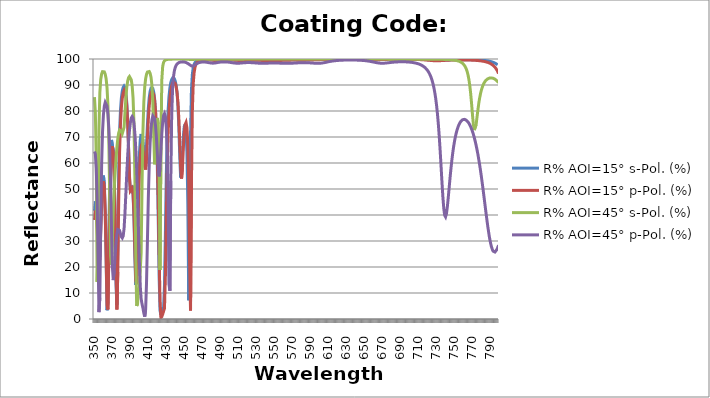
| Category | R% AOI=15° s-Pol. (%) | R% AOI=15° p-Pol. (%) | R% AOI=45° s-Pol. (%) | R% AOI=45° p-Pol. (%) |
|---|---|---|---|---|
| 350.0 | 41.572 | 38.09 | 85.307 | 64.422 |
| 351.0 | 45.249 | 41.699 | 79.458 | 63.448 |
| 352.0 | 44.06 | 40.609 | 61.927 | 58.057 |
| 353.0 | 38.142 | 35.076 | 14.269 | 46.134 |
| 354.0 | 28.981 | 26.792 | 27.487 | 25.16 |
| 355.0 | 21.946 | 20.789 | 72.655 | 2.652 |
| 356.0 | 24.435 | 23.341 | 87.043 | 8.233 |
| 357.0 | 35.24 | 33.382 | 92.11 | 37.025 |
| 358.0 | 46.308 | 43.958 | 94.226 | 59.468 |
| 359.0 | 53.208 | 50.83 | 95.124 | 71.96 |
| 360.0 | 55.157 | 53.018 | 95.356 | 78.546 |
| 361.0 | 51.788 | 50.134 | 95.069 | 81.9 |
| 362.0 | 41.693 | 41.028 | 94.191 | 83.296 |
| 363.0 | 23.242 | 24.379 | 92.413 | 83.25 |
| 364.0 | 3.369 | 5.186 | 88.995 | 81.842 |
| 365.0 | 6.671 | 3.688 | 82.308 | 78.798 |
| 366.0 | 31.47 | 24.735 | 69.187 | 73.466 |
| 367.0 | 52.332 | 46.165 | 46.756 | 64.772 |
| 368.0 | 63.872 | 59.175 | 24.282 | 51.6 |
| 369.0 | 68.868 | 65.331 | 20.784 | 34.683 |
| 370.0 | 69.14 | 66.496 | 30.938 | 19.846 |
| 371.0 | 64.509 | 62.86 | 42.529 | 14.97 |
| 372.0 | 54.734 | 54.538 | 50.104 | 18.5 |
| 373.0 | 37.317 | 39.762 | 56.232 | 24.099 |
| 374.0 | 13.31 | 18.158 | 61.559 | 29.14 |
| 375.0 | 5.451 | 3.654 | 65.991 | 32.612 |
| 376.0 | 29.756 | 18.104 | 69.36 | 34.396 |
| 377.0 | 56.143 | 44.959 | 71.583 | 34.738 |
| 378.0 | 71.897 | 64.163 | 72.684 | 34.034 |
| 379.0 | 80.399 | 75.193 | 72.777 | 32.793 |
| 380.0 | 85.068 | 81.385 | 72.132 | 31.616 |
| 381.0 | 87.674 | 84.901 | 71.341 | 31.146 |
| 382.0 | 89.066 | 86.851 | 71.436 | 31.944 |
| 383.0 | 89.618 | 87.783 | 73.777 | 34.791 |
| 384.0 | 89.06 | 87.495 | 79.353 | 40.877 |
| 385.0 | 87.113 | 85.737 | 85.05 | 48.356 |
| 386.0 | 83.177 | 82.047 | 89.086 | 55.915 |
| 387.0 | 76.172 | 75.563 | 91.504 | 62.707 |
| 388.0 | 65.465 | 65.78 | 92.782 | 68.307 |
| 389.0 | 54.248 | 55.099 | 93.251 | 72.577 |
| 390.0 | 49.335 | 49.266 | 93.024 | 75.545 |
| 391.0 | 50.412 | 49.316 | 91.989 | 77.294 |
| 392.0 | 51.313 | 50.27 | 89.703 | 77.877 |
| 393.0 | 48.096 | 48.085 | 85.043 | 77.252 |
| 394.0 | 38.789 | 40.682 | 75.327 | 75.228 |
| 395.0 | 23.698 | 27.525 | 55.161 | 71.407 |
| 396.0 | 13.07 | 14.785 | 25.367 | 65.736 |
| 397.0 | 19.108 | 13.496 | 5.05 | 57.866 |
| 398.0 | 36.681 | 26.322 | 5.812 | 47.262 |
| 399.0 | 52.706 | 42.764 | 11.521 | 34.568 |
| 400.0 | 63.074 | 55.184 | 12.143 | 22.05 |
| 401.0 | 68.774 | 62.716 | 12.055 | 12.736 |
| 402.0 | 71.173 | 66.453 | 25.494 | 7.816 |
| 403.0 | 71.048 | 67.316 | 51.474 | 5.738 |
| 404.0 | 68.763 | 65.821 | 72.042 | 4.204 |
| 405.0 | 64.84 | 62.484 | 83.413 | 2.202 |
| 406.0 | 61.081 | 58.689 | 89.27 | 0.898 |
| 407.0 | 61.056 | 57.474 | 92.399 | 3.596 |
| 408.0 | 66.834 | 61.814 | 94.154 | 13.975 |
| 409.0 | 74.678 | 69.628 | 95.029 | 30.162 |
| 410.0 | 80.988 | 76.858 | 95.343 | 46.437 |
| 411.0 | 85.11 | 81.962 | 95.189 | 59.156 |
| 412.0 | 87.538 | 85.139 | 94.49 | 67.872 |
| 413.0 | 88.756 | 86.876 | 92.989 | 73.302 |
| 414.0 | 89.101 | 87.597 | 89.929 | 76.528 |
| 415.0 | 88.647 | 87.447 | 83.578 | 78.088 |
| 416.0 | 87.283 | 86.388 | 71.382 | 78.252 |
| 417.0 | 84.662 | 84.176 | 59.5 | 77.054 |
| 418.0 | 80.068 | 80.27 | 64.178 | 74.338 |
| 419.0 | 72.186 | 73.678 | 73.333 | 69.867 |
| 420.0 | 59.005 | 62.831 | 77.279 | 63.759 |
| 421.0 | 39.15 | 46.162 | 75.01 | 57.55 |
| 422.0 | 16.861 | 25.047 | 60.561 | 54.836 |
| 423.0 | 3.292 | 7.399 | 18.829 | 58.026 |
| 424.0 | 1.53 | 0.503 | 66.03 | 64.707 |
| 425.0 | 3.537 | 0.904 | 91.855 | 71.14 |
| 426.0 | 3.857 | 1.837 | 97.175 | 75.714 |
| 427.0 | 4.35 | 1.48 | 98.742 | 78.293 |
| 428.0 | 12.821 | 4.121 | 99.342 | 79.025 |
| 429.0 | 32.722 | 16.619 | 99.614 | 77.777 |
| 430.0 | 54.676 | 37.607 | 99.753 | 73.732 |
| 431.0 | 70.591 | 57.526 | 99.831 | 64.531 |
| 432.0 | 79.933 | 70.905 | 99.876 | 45.824 |
| 433.0 | 85.519 | 79.37 | 99.906 | 13.408 |
| 434.0 | 88.868 | 84.566 | 99.925 | 10.833 |
| 435.0 | 90.879 | 87.746 | 99.938 | 53.167 |
| 436.0 | 92.048 | 89.67 | 99.947 | 78.01 |
| 437.0 | 92.632 | 90.762 | 99.954 | 88.398 |
| 438.0 | 92.747 | 91.241 | 99.959 | 93.09 |
| 439.0 | 92.404 | 91.193 | 99.962 | 95.467 |
| 440.0 | 91.518 | 90.596 | 99.964 | 96.79 |
| 441.0 | 89.858 | 89.312 | 99.965 | 97.581 |
| 442.0 | 86.965 | 87.03 | 99.965 | 98.079 |
| 443.0 | 81.993 | 83.184 | 99.965 | 98.404 |
| 444.0 | 73.745 | 76.895 | 99.964 | 98.62 |
| 445.0 | 62.756 | 67.92 | 99.961 | 98.754 |
| 446.0 | 54.398 | 58.229 | 99.958 | 98.837 |
| 447.0 | 55.795 | 54.012 | 99.954 | 98.882 |
| 448.0 | 63.354 | 58.285 | 99.949 | 98.896 |
| 449.0 | 70.122 | 65.676 | 99.942 | 98.881 |
| 450.0 | 73.971 | 71.548 | 99.933 | 98.835 |
| 451.0 | 74.846 | 74.844 | 99.922 | 98.758 |
| 452.0 | 72.349 | 75.621 | 99.908 | 98.645 |
| 453.0 | 64.333 | 73.594 | 99.893 | 98.491 |
| 454.0 | 44.197 | 67.248 | 99.875 | 98.292 |
| 455.0 | 7.219 | 52.37 | 99.858 | 98.058 |
| 456.0 | 24.94 | 20.809 | 99.844 | 97.798 |
| 457.0 | 70.666 | 3.29 | 99.834 | 97.543 |
| 458.0 | 87.912 | 50.753 | 99.831 | 97.347 |
| 459.0 | 94.086 | 79.77 | 99.834 | 97.265 |
| 460.0 | 96.691 | 90.449 | 99.842 | 97.323 |
| 461.0 | 97.956 | 94.804 | 99.853 | 97.497 |
| 462.0 | 98.638 | 96.852 | 99.864 | 97.733 |
| 463.0 | 99.037 | 97.93 | 99.875 | 97.98 |
| 464.0 | 99.284 | 98.548 | 99.884 | 98.205 |
| 465.0 | 99.446 | 98.928 | 99.892 | 98.394 |
| 466.0 | 99.555 | 99.172 | 99.899 | 98.544 |
| 467.0 | 99.631 | 99.336 | 99.904 | 98.659 |
| 468.0 | 99.684 | 99.45 | 99.908 | 98.744 |
| 469.0 | 99.723 | 99.53 | 99.912 | 98.801 |
| 470.0 | 99.751 | 99.587 | 99.913 | 98.836 |
| 471.0 | 99.771 | 99.628 | 99.914 | 98.85 |
| 472.0 | 99.784 | 99.657 | 99.914 | 98.846 |
| 473.0 | 99.793 | 99.677 | 99.913 | 98.826 |
| 474.0 | 99.797 | 99.688 | 99.911 | 98.791 |
| 475.0 | 99.796 | 99.693 | 99.909 | 98.742 |
| 476.0 | 99.792 | 99.692 | 99.905 | 98.683 |
| 477.0 | 99.784 | 99.684 | 99.901 | 98.617 |
| 478.0 | 99.771 | 99.67 | 99.896 | 98.549 |
| 479.0 | 99.753 | 99.649 | 99.891 | 98.486 |
| 480.0 | 99.729 | 99.62 | 99.886 | 98.436 |
| 481.0 | 99.698 | 99.581 | 99.882 | 98.405 |
| 482.0 | 99.661 | 99.536 | 99.88 | 98.401 |
| 483.0 | 99.618 | 99.48 | 99.878 | 98.42 |
| 484.0 | 99.567 | 99.415 | 99.879 | 98.458 |
| 485.0 | 99.512 | 99.343 | 99.881 | 98.511 |
| 486.0 | 99.457 | 99.268 | 99.885 | 98.571 |
| 487.0 | 99.411 | 99.201 | 99.89 | 98.634 |
| 488.0 | 99.381 | 99.153 | 99.895 | 98.694 |
| 489.0 | 99.374 | 99.134 | 99.9 | 98.749 |
| 490.0 | 99.39 | 99.148 | 99.905 | 98.796 |
| 491.0 | 99.424 | 99.188 | 99.91 | 98.834 |
| 492.0 | 99.466 | 99.245 | 99.914 | 98.862 |
| 493.0 | 99.51 | 99.307 | 99.917 | 98.881 |
| 494.0 | 99.552 | 99.368 | 99.92 | 98.89 |
| 495.0 | 99.589 | 99.423 | 99.922 | 98.891 |
| 496.0 | 99.62 | 99.47 | 99.923 | 98.882 |
| 497.0 | 99.646 | 99.509 | 99.923 | 98.864 |
| 498.0 | 99.665 | 99.539 | 99.923 | 98.837 |
| 499.0 | 99.679 | 99.562 | 99.921 | 98.802 |
| 500.0 | 99.688 | 99.577 | 99.919 | 98.759 |
| 501.0 | 99.693 | 99.587 | 99.917 | 98.709 |
| 502.0 | 99.694 | 99.591 | 99.914 | 98.654 |
| 503.0 | 99.692 | 99.589 | 99.91 | 98.598 |
| 504.0 | 99.685 | 99.583 | 99.907 | 98.541 |
| 505.0 | 99.676 | 99.572 | 99.904 | 98.488 |
| 506.0 | 99.663 | 99.556 | 99.903 | 98.442 |
| 507.0 | 99.647 | 99.536 | 99.903 | 98.407 |
| 508.0 | 99.628 | 99.512 | 99.904 | 98.384 |
| 509.0 | 99.607 | 99.485 | 99.908 | 98.374 |
| 510.0 | 99.585 | 99.455 | 99.913 | 98.377 |
| 511.0 | 99.562 | 99.424 | 99.919 | 98.391 |
| 512.0 | 99.541 | 99.394 | 99.926 | 98.414 |
| 513.0 | 99.523 | 99.367 | 99.932 | 98.442 |
| 514.0 | 99.509 | 99.346 | 99.938 | 98.474 |
| 515.0 | 99.501 | 99.332 | 99.944 | 98.507 |
| 516.0 | 99.499 | 99.328 | 99.949 | 98.538 |
| 517.0 | 99.504 | 99.331 | 99.953 | 98.566 |
| 518.0 | 99.513 | 99.342 | 99.956 | 98.589 |
| 519.0 | 99.526 | 99.359 | 99.959 | 98.606 |
| 520.0 | 99.541 | 99.38 | 99.962 | 98.619 |
| 521.0 | 99.558 | 99.402 | 99.964 | 98.625 |
| 522.0 | 99.574 | 99.425 | 99.965 | 98.625 |
| 523.0 | 99.59 | 99.447 | 99.966 | 98.62 |
| 524.0 | 99.604 | 99.467 | 99.967 | 98.609 |
| 525.0 | 99.616 | 99.484 | 99.968 | 98.594 |
| 526.0 | 99.625 | 99.498 | 99.968 | 98.574 |
| 527.0 | 99.633 | 99.509 | 99.968 | 98.55 |
| 528.0 | 99.638 | 99.517 | 99.968 | 98.524 |
| 529.0 | 99.641 | 99.522 | 99.967 | 98.497 |
| 530.0 | 99.642 | 99.523 | 99.967 | 98.469 |
| 531.0 | 99.64 | 99.521 | 99.966 | 98.441 |
| 532.0 | 99.636 | 99.517 | 99.966 | 98.416 |
| 533.0 | 99.63 | 99.509 | 99.965 | 98.393 |
| 534.0 | 99.622 | 99.498 | 99.965 | 98.374 |
| 535.0 | 99.612 | 99.485 | 99.965 | 98.36 |
| 536.0 | 99.599 | 99.469 | 99.966 | 98.352 |
| 537.0 | 99.585 | 99.45 | 99.966 | 98.348 |
| 538.0 | 99.569 | 99.429 | 99.968 | 98.349 |
| 539.0 | 99.552 | 99.407 | 99.969 | 98.354 |
| 540.0 | 99.535 | 99.383 | 99.971 | 98.363 |
| 541.0 | 99.517 | 99.359 | 99.973 | 98.375 |
| 542.0 | 99.501 | 99.336 | 99.975 | 98.388 |
| 543.0 | 99.486 | 99.315 | 99.978 | 98.402 |
| 544.0 | 99.474 | 99.296 | 99.98 | 98.415 |
| 545.0 | 99.466 | 99.282 | 99.982 | 98.428 |
| 546.0 | 99.462 | 99.273 | 99.983 | 98.439 |
| 547.0 | 99.463 | 99.269 | 99.985 | 98.448 |
| 548.0 | 99.469 | 99.271 | 99.986 | 98.454 |
| 549.0 | 99.48 | 99.279 | 99.988 | 98.458 |
| 550.0 | 99.493 | 99.292 | 99.989 | 98.458 |
| 551.0 | 99.51 | 99.308 | 99.99 | 98.456 |
| 552.0 | 99.529 | 99.328 | 99.99 | 98.45 |
| 553.0 | 99.548 | 99.349 | 99.991 | 98.442 |
| 554.0 | 99.568 | 99.373 | 99.992 | 98.435 |
| 555.0 | 99.587 | 99.396 | 99.992 | 98.426 |
| 556.0 | 99.606 | 99.418 | 99.993 | 98.415 |
| 557.0 | 99.623 | 99.439 | 99.993 | 98.404 |
| 558.0 | 99.638 | 99.459 | 99.994 | 98.391 |
| 559.0 | 99.652 | 99.477 | 99.994 | 98.379 |
| 560.0 | 99.665 | 99.494 | 99.994 | 98.367 |
| 561.0 | 99.676 | 99.508 | 99.995 | 98.356 |
| 562.0 | 99.686 | 99.521 | 99.995 | 98.347 |
| 563.0 | 99.694 | 99.532 | 99.995 | 98.341 |
| 564.0 | 99.701 | 99.542 | 99.995 | 98.337 |
| 565.0 | 99.706 | 99.55 | 99.996 | 98.336 |
| 566.0 | 99.711 | 99.557 | 99.996 | 98.339 |
| 567.0 | 99.714 | 99.562 | 99.996 | 98.345 |
| 568.0 | 99.716 | 99.566 | 99.996 | 98.354 |
| 569.0 | 99.718 | 99.568 | 99.996 | 98.367 |
| 570.0 | 99.719 | 99.57 | 99.996 | 98.382 |
| 571.0 | 99.718 | 99.57 | 99.996 | 98.4 |
| 572.0 | 99.718 | 99.57 | 99.996 | 98.42 |
| 573.0 | 99.717 | 99.569 | 99.996 | 98.44 |
| 574.0 | 99.715 | 99.568 | 99.996 | 98.461 |
| 575.0 | 99.713 | 99.566 | 99.996 | 98.482 |
| 576.0 | 99.712 | 99.563 | 99.996 | 98.503 |
| 577.0 | 99.71 | 99.561 | 99.996 | 98.522 |
| 578.0 | 99.709 | 99.559 | 99.996 | 98.539 |
| 579.0 | 99.708 | 99.557 | 99.996 | 98.554 |
| 580.0 | 99.708 | 99.555 | 99.996 | 98.567 |
| 581.0 | 99.709 | 99.555 | 99.996 | 98.577 |
| 582.0 | 99.711 | 99.555 | 99.996 | 98.584 |
| 583.0 | 99.714 | 99.556 | 99.996 | 98.587 |
| 584.0 | 99.719 | 99.559 | 99.996 | 98.587 |
| 585.0 | 99.724 | 99.563 | 99.996 | 98.584 |
| 586.0 | 99.731 | 99.569 | 99.996 | 98.577 |
| 587.0 | 99.739 | 99.576 | 99.996 | 98.566 |
| 588.0 | 99.748 | 99.585 | 99.996 | 98.552 |
| 589.0 | 99.758 | 99.595 | 99.996 | 98.534 |
| 590.0 | 99.768 | 99.606 | 99.996 | 98.514 |
| 591.0 | 99.778 | 99.618 | 99.996 | 98.491 |
| 592.0 | 99.789 | 99.631 | 99.996 | 98.466 |
| 593.0 | 99.8 | 99.645 | 99.996 | 98.44 |
| 594.0 | 99.81 | 99.658 | 99.996 | 98.414 |
| 595.0 | 99.82 | 99.673 | 99.996 | 98.389 |
| 596.0 | 99.83 | 99.687 | 99.996 | 98.366 |
| 597.0 | 99.84 | 99.701 | 99.995 | 98.349 |
| 598.0 | 99.848 | 99.714 | 99.995 | 98.337 |
| 599.0 | 99.857 | 99.727 | 99.995 | 98.334 |
| 600.0 | 99.864 | 99.74 | 99.995 | 98.34 |
| 601.0 | 99.871 | 99.752 | 99.995 | 98.358 |
| 602.0 | 99.878 | 99.764 | 99.994 | 98.387 |
| 603.0 | 99.884 | 99.774 | 99.994 | 98.428 |
| 604.0 | 99.89 | 99.785 | 99.994 | 98.478 |
| 605.0 | 99.895 | 99.794 | 99.993 | 98.538 |
| 606.0 | 99.9 | 99.803 | 99.993 | 98.604 |
| 607.0 | 99.904 | 99.811 | 99.992 | 98.675 |
| 608.0 | 99.908 | 99.819 | 99.992 | 98.749 |
| 609.0 | 99.912 | 99.826 | 99.991 | 98.823 |
| 610.0 | 99.916 | 99.832 | 99.991 | 98.896 |
| 611.0 | 99.919 | 99.838 | 99.99 | 98.967 |
| 612.0 | 99.921 | 99.844 | 99.989 | 99.035 |
| 613.0 | 99.924 | 99.849 | 99.988 | 99.098 |
| 614.0 | 99.926 | 99.853 | 99.987 | 99.157 |
| 615.0 | 99.928 | 99.857 | 99.985 | 99.211 |
| 616.0 | 99.93 | 99.861 | 99.984 | 99.261 |
| 617.0 | 99.932 | 99.864 | 99.982 | 99.306 |
| 618.0 | 99.933 | 99.866 | 99.98 | 99.347 |
| 619.0 | 99.934 | 99.869 | 99.977 | 99.383 |
| 620.0 | 99.935 | 99.871 | 99.975 | 99.416 |
| 621.0 | 99.936 | 99.873 | 99.972 | 99.446 |
| 622.0 | 99.937 | 99.874 | 99.968 | 99.472 |
| 623.0 | 99.937 | 99.875 | 99.965 | 99.495 |
| 624.0 | 99.938 | 99.876 | 99.961 | 99.516 |
| 625.0 | 99.938 | 99.876 | 99.958 | 99.534 |
| 626.0 | 99.938 | 99.876 | 99.955 | 99.55 |
| 627.0 | 99.938 | 99.876 | 99.953 | 99.564 |
| 628.0 | 99.937 | 99.875 | 99.951 | 99.575 |
| 629.0 | 99.937 | 99.874 | 99.951 | 99.585 |
| 630.0 | 99.936 | 99.872 | 99.951 | 99.593 |
| 631.0 | 99.935 | 99.87 | 99.953 | 99.6 |
| 632.0 | 99.934 | 99.868 | 99.955 | 99.605 |
| 633.0 | 99.933 | 99.865 | 99.957 | 99.608 |
| 634.0 | 99.932 | 99.862 | 99.96 | 99.61 |
| 635.0 | 99.93 | 99.858 | 99.963 | 99.611 |
| 636.0 | 99.928 | 99.854 | 99.965 | 99.61 |
| 637.0 | 99.926 | 99.849 | 99.968 | 99.608 |
| 638.0 | 99.923 | 99.844 | 99.97 | 99.604 |
| 639.0 | 99.92 | 99.837 | 99.972 | 99.598 |
| 640.0 | 99.917 | 99.83 | 99.974 | 99.592 |
| 641.0 | 99.913 | 99.822 | 99.975 | 99.583 |
| 642.0 | 99.908 | 99.813 | 99.977 | 99.573 |
| 643.0 | 99.904 | 99.803 | 99.978 | 99.561 |
| 644.0 | 99.898 | 99.792 | 99.979 | 99.547 |
| 645.0 | 99.892 | 99.78 | 99.98 | 99.531 |
| 646.0 | 99.886 | 99.767 | 99.98 | 99.512 |
| 647.0 | 99.878 | 99.752 | 99.981 | 99.491 |
| 648.0 | 99.87 | 99.737 | 99.982 | 99.468 |
| 649.0 | 99.861 | 99.721 | 99.982 | 99.441 |
| 650.0 | 99.851 | 99.704 | 99.982 | 99.411 |
| 651.0 | 99.84 | 99.686 | 99.983 | 99.378 |
| 652.0 | 99.828 | 99.669 | 99.983 | 99.341 |
| 653.0 | 99.816 | 99.653 | 99.983 | 99.3 |
| 654.0 | 99.803 | 99.639 | 99.983 | 99.255 |
| 655.0 | 99.79 | 99.626 | 99.983 | 99.205 |
| 656.0 | 99.777 | 99.618 | 99.983 | 99.15 |
| 657.0 | 99.766 | 99.613 | 99.982 | 99.091 |
| 658.0 | 99.756 | 99.612 | 99.982 | 99.027 |
| 659.0 | 99.747 | 99.616 | 99.982 | 98.96 |
| 660.0 | 99.742 | 99.624 | 99.981 | 98.888 |
| 661.0 | 99.74 | 99.635 | 99.981 | 98.814 |
| 662.0 | 99.742 | 99.649 | 99.98 | 98.742 |
| 663.0 | 99.746 | 99.666 | 99.979 | 98.672 |
| 664.0 | 99.753 | 99.683 | 99.978 | 98.605 |
| 665.0 | 99.762 | 99.701 | 99.978 | 98.542 |
| 666.0 | 99.773 | 99.718 | 99.976 | 98.487 |
| 667.0 | 99.785 | 99.736 | 99.975 | 98.44 |
| 668.0 | 99.797 | 99.752 | 99.974 | 98.405 |
| 669.0 | 99.809 | 99.767 | 99.972 | 98.381 |
| 670.0 | 99.82 | 99.781 | 99.97 | 98.37 |
| 671.0 | 99.832 | 99.794 | 99.968 | 98.37 |
| 672.0 | 99.842 | 99.806 | 99.966 | 98.382 |
| 673.0 | 99.852 | 99.817 | 99.963 | 98.403 |
| 674.0 | 99.861 | 99.827 | 99.96 | 98.432 |
| 675.0 | 99.869 | 99.836 | 99.956 | 98.467 |
| 676.0 | 99.876 | 99.844 | 99.952 | 98.506 |
| 677.0 | 99.883 | 99.851 | 99.947 | 98.547 |
| 678.0 | 99.889 | 99.857 | 99.942 | 98.589 |
| 679.0 | 99.894 | 99.862 | 99.936 | 98.631 |
| 680.0 | 99.899 | 99.868 | 99.929 | 98.672 |
| 681.0 | 99.903 | 99.872 | 99.921 | 98.71 |
| 682.0 | 99.906 | 99.876 | 99.912 | 98.746 |
| 683.0 | 99.91 | 99.879 | 99.902 | 98.779 |
| 684.0 | 99.913 | 99.882 | 99.892 | 98.809 |
| 685.0 | 99.915 | 99.884 | 99.881 | 98.836 |
| 686.0 | 99.917 | 99.886 | 99.87 | 98.86 |
| 687.0 | 99.919 | 99.888 | 99.859 | 98.88 |
| 688.0 | 99.92 | 99.889 | 99.849 | 98.896 |
| 689.0 | 99.922 | 99.889 | 99.841 | 98.91 |
| 690.0 | 99.922 | 99.89 | 99.835 | 98.919 |
| 691.0 | 99.923 | 99.89 | 99.831 | 98.926 |
| 692.0 | 99.924 | 99.89 | 99.831 | 98.929 |
| 693.0 | 99.924 | 99.889 | 99.833 | 98.929 |
| 694.0 | 99.924 | 99.888 | 99.838 | 98.926 |
| 695.0 | 99.923 | 99.887 | 99.844 | 98.918 |
| 696.0 | 99.923 | 99.885 | 99.851 | 98.908 |
| 697.0 | 99.922 | 99.883 | 99.859 | 98.894 |
| 698.0 | 99.921 | 99.88 | 99.867 | 98.876 |
| 699.0 | 99.919 | 99.877 | 99.875 | 98.853 |
| 700.0 | 99.918 | 99.874 | 99.882 | 98.827 |
| 701.0 | 99.916 | 99.87 | 99.889 | 98.796 |
| 702.0 | 99.913 | 99.865 | 99.895 | 98.76 |
| 703.0 | 99.91 | 99.86 | 99.9 | 98.718 |
| 704.0 | 99.907 | 99.854 | 99.905 | 98.671 |
| 705.0 | 99.904 | 99.848 | 99.91 | 98.617 |
| 706.0 | 99.9 | 99.84 | 99.914 | 98.556 |
| 707.0 | 99.896 | 99.832 | 99.917 | 98.486 |
| 708.0 | 99.89 | 99.823 | 99.92 | 98.408 |
| 709.0 | 99.885 | 99.813 | 99.922 | 98.319 |
| 710.0 | 99.878 | 99.801 | 99.925 | 98.219 |
| 711.0 | 99.871 | 99.788 | 99.926 | 98.106 |
| 712.0 | 99.864 | 99.774 | 99.928 | 97.978 |
| 713.0 | 99.855 | 99.758 | 99.929 | 97.832 |
| 714.0 | 99.845 | 99.741 | 99.93 | 97.666 |
| 715.0 | 99.834 | 99.721 | 99.931 | 97.477 |
| 716.0 | 99.821 | 99.7 | 99.931 | 97.26 |
| 717.0 | 99.807 | 99.676 | 99.931 | 97.012 |
| 718.0 | 99.792 | 99.65 | 99.931 | 96.726 |
| 719.0 | 99.775 | 99.622 | 99.931 | 96.395 |
| 720.0 | 99.756 | 99.591 | 99.93 | 96.01 |
| 721.0 | 99.735 | 99.559 | 99.93 | 95.561 |
| 722.0 | 99.713 | 99.526 | 99.929 | 95.035 |
| 723.0 | 99.688 | 99.491 | 99.927 | 94.414 |
| 724.0 | 99.662 | 99.457 | 99.926 | 93.679 |
| 725.0 | 99.635 | 99.424 | 99.924 | 92.804 |
| 726.0 | 99.607 | 99.393 | 99.922 | 91.755 |
| 727.0 | 99.58 | 99.366 | 99.92 | 90.492 |
| 728.0 | 99.553 | 99.344 | 99.917 | 88.966 |
| 729.0 | 99.528 | 99.327 | 99.914 | 87.111 |
| 730.0 | 99.507 | 99.317 | 99.91 | 84.854 |
| 731.0 | 99.49 | 99.314 | 99.906 | 82.104 |
| 732.0 | 99.478 | 99.318 | 99.902 | 78.767 |
| 733.0 | 99.472 | 99.327 | 99.897 | 74.751 |
| 734.0 | 99.471 | 99.341 | 99.891 | 70.012 |
| 735.0 | 99.476 | 99.358 | 99.885 | 64.604 |
| 736.0 | 99.485 | 99.378 | 99.878 | 58.666 |
| 737.0 | 99.497 | 99.4 | 99.87 | 52.576 |
| 738.0 | 99.513 | 99.422 | 99.862 | 46.971 |
| 739.0 | 99.53 | 99.444 | 99.852 | 42.55 |
| 740.0 | 99.548 | 99.466 | 99.841 | 39.893 |
| 741.0 | 99.567 | 99.487 | 99.829 | 39.272 |
| 742.0 | 99.585 | 99.507 | 99.815 | 40.534 |
| 743.0 | 99.602 | 99.526 | 99.799 | 43.205 |
| 744.0 | 99.619 | 99.543 | 99.781 | 46.708 |
| 745.0 | 99.635 | 99.559 | 99.761 | 50.537 |
| 746.0 | 99.649 | 99.573 | 99.738 | 54.332 |
| 747.0 | 99.663 | 99.586 | 99.711 | 57.88 |
| 748.0 | 99.675 | 99.597 | 99.68 | 61.078 |
| 749.0 | 99.686 | 99.607 | 99.644 | 63.892 |
| 750.0 | 99.695 | 99.616 | 99.602 | 66.33 |
| 751.0 | 99.704 | 99.623 | 99.554 | 68.42 |
| 752.0 | 99.712 | 99.63 | 99.496 | 70.196 |
| 753.0 | 99.718 | 99.635 | 99.428 | 71.693 |
| 754.0 | 99.724 | 99.639 | 99.348 | 72.944 |
| 755.0 | 99.729 | 99.642 | 99.251 | 73.978 |
| 756.0 | 99.732 | 99.644 | 99.134 | 74.821 |
| 757.0 | 99.736 | 99.645 | 98.991 | 75.493 |
| 758.0 | 99.738 | 99.645 | 98.816 | 76.012 |
| 759.0 | 99.739 | 99.644 | 98.6 | 76.391 |
| 760.0 | 99.74 | 99.642 | 98.328 | 76.642 |
| 761.0 | 99.74 | 99.639 | 97.984 | 76.772 |
| 762.0 | 99.74 | 99.635 | 97.543 | 76.79 |
| 763.0 | 99.738 | 99.63 | 96.972 | 76.698 |
| 764.0 | 99.736 | 99.624 | 96.222 | 76.5 |
| 765.0 | 99.733 | 99.617 | 95.228 | 76.196 |
| 766.0 | 99.729 | 99.608 | 93.895 | 75.788 |
| 767.0 | 99.725 | 99.599 | 92.102 | 75.273 |
| 768.0 | 99.72 | 99.588 | 89.702 | 74.649 |
| 769.0 | 99.713 | 99.575 | 86.565 | 73.913 |
| 770.0 | 99.706 | 99.561 | 82.697 | 73.06 |
| 771.0 | 99.698 | 99.545 | 78.456 | 72.084 |
| 772.0 | 99.689 | 99.527 | 74.732 | 70.981 |
| 773.0 | 99.679 | 99.508 | 72.668 | 69.744 |
| 774.0 | 99.667 | 99.485 | 72.836 | 68.367 |
| 775.0 | 99.654 | 99.461 | 74.786 | 66.842 |
| 776.0 | 99.64 | 99.433 | 77.572 | 65.166 |
| 777.0 | 99.624 | 99.403 | 80.429 | 63.333 |
| 778.0 | 99.606 | 99.369 | 82.976 | 61.342 |
| 779.0 | 99.586 | 99.331 | 85.102 | 59.193 |
| 780.0 | 99.564 | 99.288 | 86.823 | 56.89 |
| 781.0 | 99.539 | 99.241 | 88.198 | 54.444 |
| 782.0 | 99.512 | 99.188 | 89.291 | 51.87 |
| 783.0 | 99.481 | 99.128 | 90.159 | 49.193 |
| 784.0 | 99.447 | 99.06 | 90.847 | 46.442 |
| 785.0 | 99.409 | 98.984 | 91.389 | 43.66 |
| 786.0 | 99.366 | 98.897 | 91.814 | 40.895 |
| 787.0 | 99.317 | 98.798 | 92.141 | 38.202 |
| 788.0 | 99.262 | 98.686 | 92.385 | 35.642 |
| 789.0 | 99.2 | 98.557 | 92.558 | 33.278 |
| 790.0 | 99.13 | 98.409 | 92.668 | 31.167 |
| 791.0 | 99.05 | 98.238 | 92.721 | 29.361 |
| 792.0 | 98.959 | 98.04 | 92.721 | 27.901 |
| 793.0 | 98.854 | 97.808 | 92.672 | 26.81 |
| 794.0 | 98.733 | 97.537 | 92.574 | 26.098 |
| 795.0 | 98.594 | 97.218 | 92.427 | 25.755 |
| 796.0 | 98.431 | 96.839 | 92.23 | 25.758 |
| 797.0 | 98.241 | 96.387 | 91.982 | 26.07 |
| 798.0 | 98.018 | 95.845 | 91.679 | 26.647 |
| 799.0 | 97.754 | 95.19 | 91.318 | 27.439 |
| 800.0 | 97.441 | 94.394 | 90.892 | 28.396 |